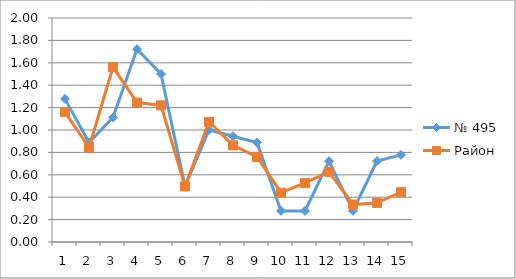
| Category | № 495 | Район |
|---|---|---|
| 0 | 1.278 | 1.16 |
| 1 | 0.889 | 0.844 |
| 2 | 1.111 | 1.562 |
| 3 | 1.722 | 1.245 |
| 4 | 1.5 | 1.22 |
| 5 | 0.5 | 0.496 |
| 6 | 1 | 1.072 |
| 7 | 0.944 | 0.863 |
| 8 | 0.889 | 0.76 |
| 9 | 0.278 | 0.44 |
| 10 | 0.278 | 0.527 |
| 11 | 0.722 | 0.627 |
| 12 | 0.278 | 0.334 |
| 13 | 0.722 | 0.349 |
| 14 | 0.778 | 0.445 |